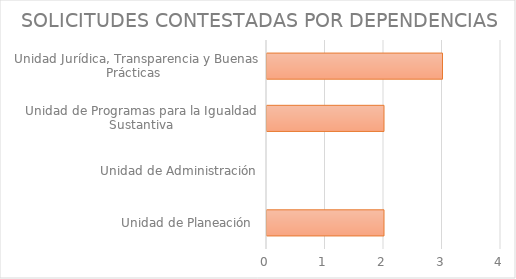
| Category | Series 1 |
|---|---|
| Unidad de Planeación  | 2 |
| Unidad de Administración | 0 |
| Unidad de Programas para la Igualdad Sustantiva | 2 |
| Unidad Jurídica, Transparencia y Buenas Prácticas  | 3 |